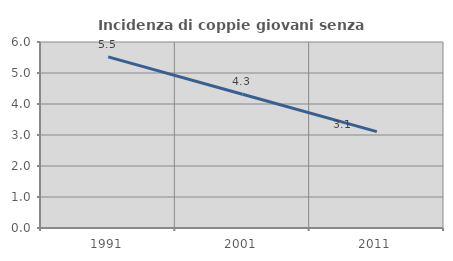
| Category | Incidenza di coppie giovani senza figli |
|---|---|
| 1991.0 | 5.519 |
| 2001.0 | 4.315 |
| 2011.0 | 3.109 |